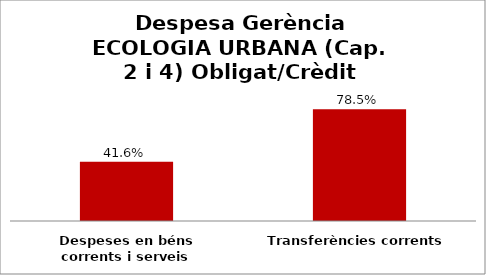
| Category | Series 0 |
|---|---|
| Despeses en béns corrents i serveis | 0.416 |
| Transferències corrents | 0.785 |